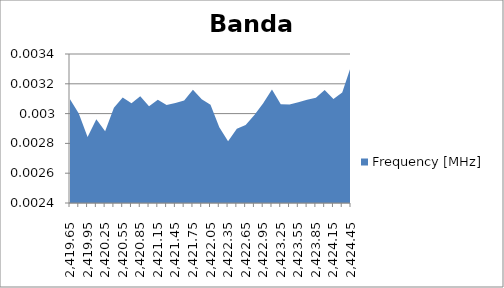
| Category | Frequency [MHz] |
|---|---|
| 2419.65 | 0.003 |
| 2419.8 | 0.003 |
| 2419.95 | 0.003 |
| 2420.1 | 0.003 |
| 2420.25 | 0.003 |
| 2420.4 | 0.003 |
| 2420.55 | 0.003 |
| 2420.7 | 0.003 |
| 2420.85 | 0.003 |
| 2421.0 | 0.003 |
| 2421.15 | 0.003 |
| 2421.3 | 0.003 |
| 2421.45 | 0.003 |
| 2421.6 | 0.003 |
| 2421.75 | 0.003 |
| 2421.9 | 0.003 |
| 2422.05 | 0.003 |
| 2422.2 | 0.003 |
| 2422.35 | 0.003 |
| 2422.5 | 0.003 |
| 2422.65 | 0.003 |
| 2422.8 | 0.003 |
| 2422.95 | 0.003 |
| 2423.1 | 0.003 |
| 2423.25 | 0.003 |
| 2423.4 | 0.003 |
| 2423.55 | 0.003 |
| 2423.7 | 0.003 |
| 2423.85 | 0.003 |
| 2424.0 | 0.003 |
| 2424.15 | 0.003 |
| 2424.3 | 0.003 |
| 2424.45 | 0.003 |